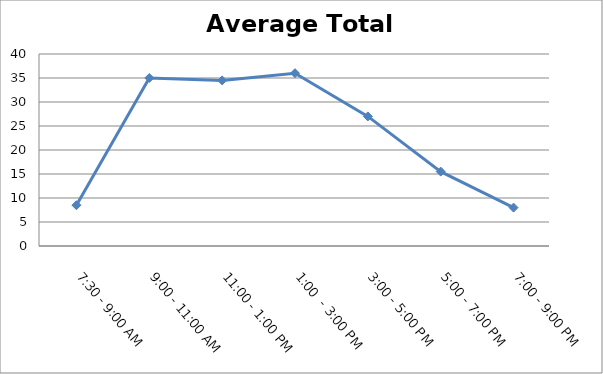
| Category | Total |
|---|---|
| 7:30 - 9:00 AM | 8.5 |
| 9:00 - 11:00 AM | 35 |
| 11:00 - 1:00 PM | 34.5 |
| 1:00  - 3:00 PM | 36 |
| 3:00 - 5:00 PM | 27 |
| 5:00 - 7:00 PM | 15.5 |
| 7:00 - 9:00 PM | 8 |